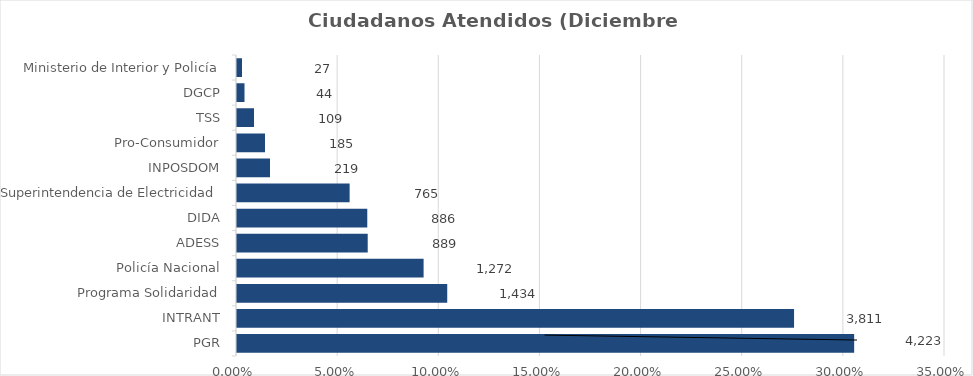
| Category | Porcentaje |
|---|---|
| PGR | 0.305 |
| INTRANT | 0.275 |
| Programa Solidaridad | 0.103 |
| Policía Nacional | 0.092 |
| ADESS | 0.064 |
| DIDA | 0.064 |
| Superintendencia de Electricidad | 0.055 |
| INPOSDOM | 0.016 |
| Pro-Consumidor | 0.013 |
| TSS | 0.008 |
| DGCP | 0.003 |
| Ministerio de Interior y Policía | 0.002 |